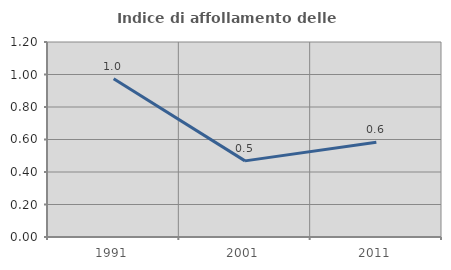
| Category | Indice di affollamento delle abitazioni  |
|---|---|
| 1991.0 | 0.973 |
| 2001.0 | 0.468 |
| 2011.0 | 0.584 |